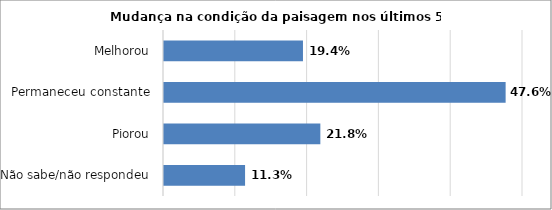
| Category | Series 0 |
|---|---|
| Não sabe/não respondeu | 0.113 |
| Piorou | 0.218 |
| Permaneceu constante | 0.476 |
| Melhorou | 0.194 |